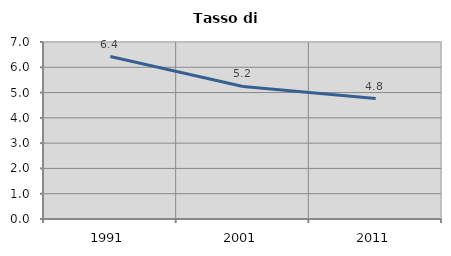
| Category | Tasso di disoccupazione   |
|---|---|
| 1991.0 | 6.426 |
| 2001.0 | 5.242 |
| 2011.0 | 4.762 |